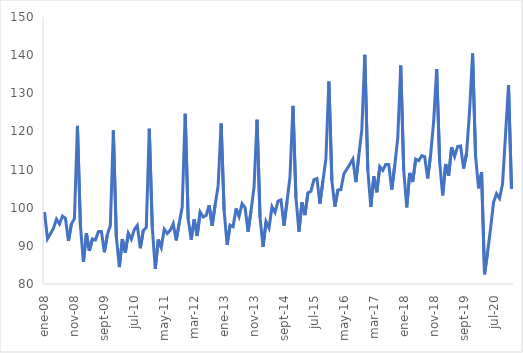
| Category | Original |
|---|---|
| 2008-01-01 | 98.866 |
| 2008-02-01 | 91.845 |
| 2008-03-01 | 93.189 |
| 2008-04-01 | 94.632 |
| 2008-05-01 | 96.978 |
| 2008-06-01 | 95.732 |
| 2008-07-01 | 97.799 |
| 2008-08-01 | 97.212 |
| 2008-09-01 | 91.285 |
| 2008-10-01 | 95.806 |
| 2008-11-01 | 97.131 |
| 2008-12-01 | 121.45 |
| 2009-01-01 | 95.276 |
| 2009-02-01 | 85.776 |
| 2009-03-01 | 93.28 |
| 2009-04-01 | 88.678 |
| 2009-05-01 | 91.826 |
| 2009-06-01 | 91.529 |
| 2009-07-01 | 93.734 |
| 2009-08-01 | 93.778 |
| 2009-09-01 | 88.341 |
| 2009-10-01 | 92.941 |
| 2009-11-01 | 95.372 |
| 2009-12-01 | 120.247 |
| 2010-01-01 | 92.32 |
| 2010-02-01 | 84.42 |
| 2010-03-01 | 91.762 |
| 2010-04-01 | 88.178 |
| 2010-05-01 | 93.303 |
| 2010-06-01 | 91.747 |
| 2010-07-01 | 94.264 |
| 2010-08-01 | 95.339 |
| 2010-09-01 | 89.376 |
| 2010-10-01 | 94.015 |
| 2010-11-01 | 94.801 |
| 2010-12-01 | 120.698 |
| 2011-01-01 | 94.918 |
| 2011-02-01 | 83.987 |
| 2011-03-01 | 91.666 |
| 2011-04-01 | 89.605 |
| 2011-05-01 | 94.353 |
| 2011-06-01 | 93.231 |
| 2011-07-01 | 94.074 |
| 2011-08-01 | 95.789 |
| 2011-09-01 | 91.436 |
| 2011-10-01 | 95.961 |
| 2011-11-01 | 100.165 |
| 2011-12-01 | 124.623 |
| 2012-01-01 | 97.006 |
| 2012-02-01 | 91.631 |
| 2012-03-01 | 96.93 |
| 2012-04-01 | 92.591 |
| 2012-05-01 | 98.884 |
| 2012-06-01 | 97.579 |
| 2012-07-01 | 97.976 |
| 2012-08-01 | 100.634 |
| 2012-09-01 | 95.261 |
| 2012-10-01 | 100.738 |
| 2012-11-01 | 105.68 |
| 2012-12-01 | 122.082 |
| 2013-01-01 | 99.32 |
| 2013-02-01 | 90.235 |
| 2013-03-01 | 95.429 |
| 2013-04-01 | 95.022 |
| 2013-05-01 | 99.806 |
| 2013-06-01 | 97.695 |
| 2013-07-01 | 101.068 |
| 2013-08-01 | 100.029 |
| 2013-09-01 | 93.71 |
| 2013-10-01 | 99.24 |
| 2013-11-01 | 105.378 |
| 2013-12-01 | 123.068 |
| 2014-01-01 | 97.427 |
| 2014-02-01 | 89.714 |
| 2014-03-01 | 96.392 |
| 2014-04-01 | 94.683 |
| 2014-05-01 | 100.238 |
| 2014-06-01 | 98.75 |
| 2014-07-01 | 101.712 |
| 2014-08-01 | 102.042 |
| 2014-09-01 | 95.303 |
| 2014-10-01 | 101.569 |
| 2014-11-01 | 108.059 |
| 2014-12-01 | 126.707 |
| 2015-01-01 | 102.635 |
| 2015-02-01 | 93.71 |
| 2015-03-01 | 101.403 |
| 2015-04-01 | 98.067 |
| 2015-05-01 | 103.919 |
| 2015-06-01 | 104.293 |
| 2015-07-01 | 107.342 |
| 2015-08-01 | 107.646 |
| 2015-09-01 | 101.08 |
| 2015-10-01 | 107.045 |
| 2015-11-01 | 112.803 |
| 2015-12-01 | 133.104 |
| 2016-01-01 | 107.03 |
| 2016-02-01 | 100.26 |
| 2016-03-01 | 104.644 |
| 2016-04-01 | 104.733 |
| 2016-05-01 | 108.885 |
| 2016-06-01 | 110.12 |
| 2016-07-01 | 111.36 |
| 2016-08-01 | 112.742 |
| 2016-09-01 | 106.705 |
| 2016-10-01 | 113.718 |
| 2016-11-01 | 120.404 |
| 2016-12-01 | 140.083 |
| 2017-01-01 | 109.896 |
| 2017-02-01 | 100.245 |
| 2017-03-01 | 108.211 |
| 2017-04-01 | 104.05 |
| 2017-05-01 | 110.791 |
| 2017-06-01 | 109.806 |
| 2017-07-01 | 111.354 |
| 2017-08-01 | 111.295 |
| 2017-09-01 | 104.769 |
| 2017-10-01 | 111.103 |
| 2017-11-01 | 118.261 |
| 2017-12-01 | 137.265 |
| 2018-01-01 | 109.745 |
| 2018-02-01 | 100.093 |
| 2018-03-01 | 109.111 |
| 2018-04-01 | 106.743 |
| 2018-05-01 | 112.744 |
| 2018-06-01 | 112.315 |
| 2018-07-01 | 113.64 |
| 2018-08-01 | 113.369 |
| 2018-09-01 | 107.673 |
| 2018-10-01 | 113.974 |
| 2018-11-01 | 122.674 |
| 2018-12-01 | 136.356 |
| 2019-01-01 | 112.044 |
| 2019-02-01 | 103.226 |
| 2019-03-01 | 111.457 |
| 2019-04-01 | 108.39 |
| 2019-05-01 | 115.875 |
| 2019-06-01 | 113.452 |
| 2019-07-01 | 116.021 |
| 2019-08-01 | 116.178 |
| 2019-09-01 | 110.286 |
| 2019-10-01 | 114.357 |
| 2019-11-01 | 125.47 |
| 2019-12-01 | 140.451 |
| 2020-01-01 | 113.485 |
| 2020-02-01 | 105.073 |
| 2020-03-01 | 109.275 |
| 2020-04-01 | 82.558 |
| 2020-05-01 | 88.321 |
| 2020-06-01 | 94.531 |
| 2020-07-01 | 101.439 |
| 2020-08-01 | 103.669 |
| 2020-09-01 | 102.464 |
| 2020-10-01 | 106.225 |
| 2020-11-01 | 119.087 |
| 2020-12-01 | 132.106 |
| 2021-01-01 | 104.898 |